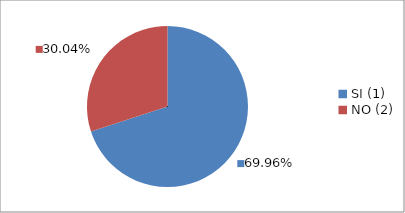
| Category | Series 0 |
|---|---|
| SI (1) | 0.7 |
| NO (2) | 0.3 |